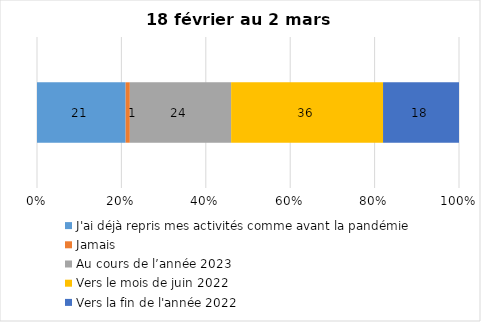
| Category | J'ai déjà repris mes activités comme avant la pandémie | Jamais | Au cours de l’année 2023 | Vers le mois de juin 2022 | Vers la fin de l'année 2022 |
|---|---|---|---|---|---|
| 0 | 21 | 1 | 24 | 36 | 18 |